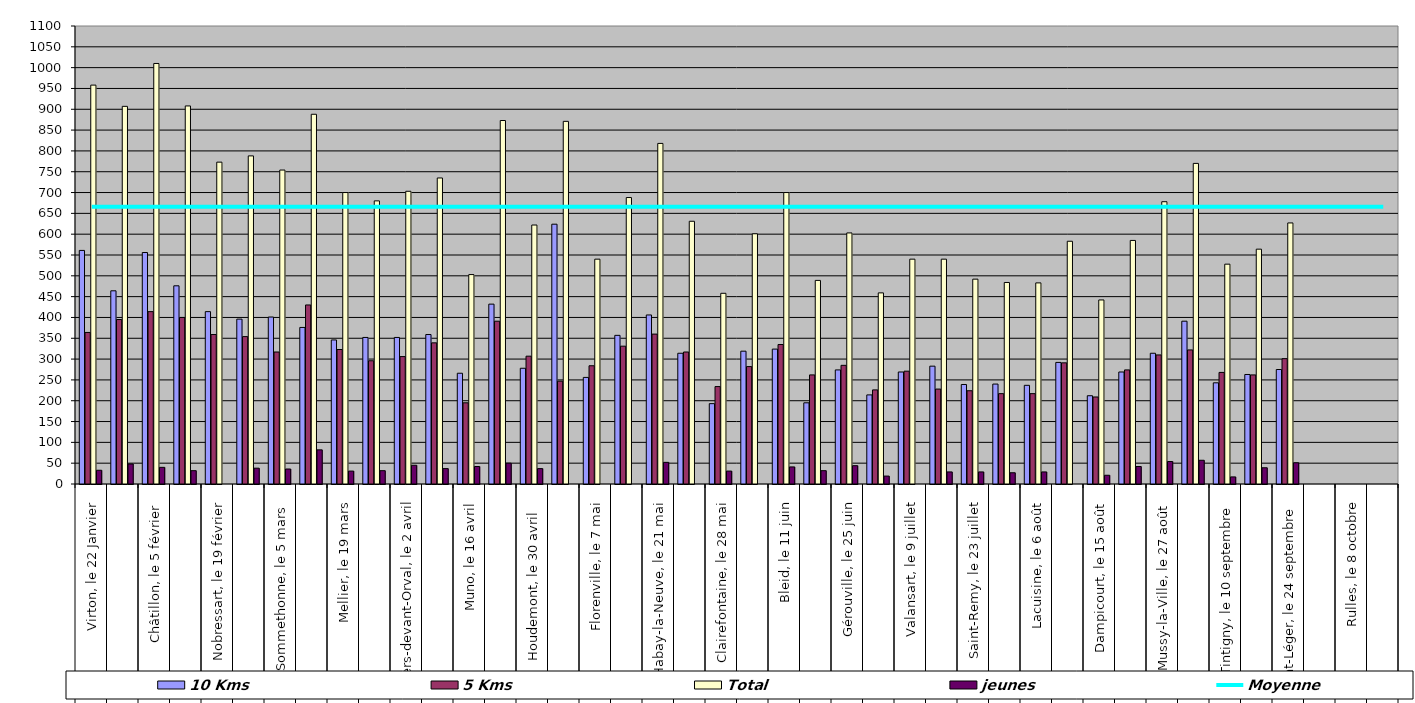
| Category | 10 Kms | 5 Kms | Total | jeunes |
|---|---|---|---|---|
| 0 | 561 | 364 | 958 | 33 |
| 1 | 464 | 395 | 907 | 48 |
| 2 | 556 | 414 | 1010 | 40 |
| 3 | 476 | 400 | 908 | 32 |
| 4 | 414 | 359 | 773 | 0 |
| 5 | 396 | 354 | 788 | 38 |
| 6 | 401 | 317 | 754 | 36 |
| 7 | 376 | 430 | 888 | 82 |
| 8 | 346 | 323 | 700 | 31 |
| 9 | 352 | 296 | 680 | 32 |
| 10 | 352 | 306 | 703 | 45 |
| 11 | 359 | 339 | 735 | 37 |
| 12 | 266 | 195 | 503 | 42 |
| 13 | 432 | 391 | 873 | 50 |
| 14 | 278 | 307 | 622 | 37 |
| 15 | 624 | 247 | 871 | 0 |
| 16 | 256 | 284 | 540 | 0 |
| 17 | 357 | 331 | 688 | 0 |
| 18 | 406 | 360 | 818 | 52 |
| 19 | 314 | 317 | 631 | 0 |
| 20 | 193 | 234 | 458 | 31 |
| 21 | 319 | 282 | 601 | 0 |
| 22 | 324 | 335 | 700 | 41 |
| 23 | 195 | 262 | 489 | 32 |
| 24 | 274 | 285 | 603 | 44 |
| 25 | 214 | 226 | 459 | 19 |
| 26 | 269 | 271 | 540 | 0 |
| 27 | 283 | 228 | 540 | 29 |
| 28 | 239 | 224 | 492 | 29 |
| 29 | 240 | 217 | 484 | 27 |
| 30 | 237 | 217 | 483 | 29 |
| 31 | 292 | 291 | 583 | 0 |
| 32 | 212 | 209 | 442 | 21 |
| 33 | 269 | 274 | 585 | 42 |
| 34 | 314 | 310 | 678 | 54 |
| 35 | 391 | 322 | 770 | 57 |
| 36 | 243 | 268 | 528 | 17 |
| 37 | 263 | 262 | 564 | 39 |
| 38 | 275 | 301 | 627 | 51 |
| 39 | 0 | 0 | 0 | 0 |
| 40 | 0 | 0 | 0 | 0 |
| 41 | 0 | 0 | 0 | 0 |